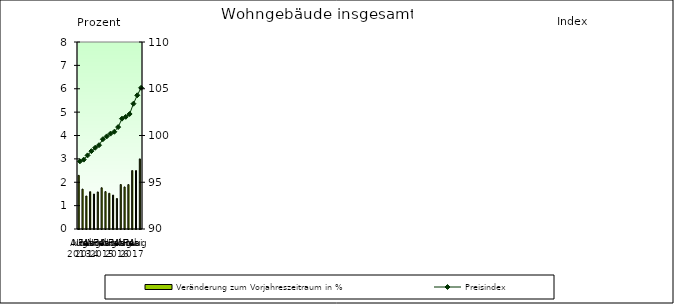
| Category | Veränderung zum Vorjahreszeitraum in % |
|---|---|
| 0 | 2.294 |
| 1 | 1.708 |
| 2 | 1.412 |
| 3 | 1.596 |
| 4 | 1.495 |
| 5 | 1.586 |
| 6 | 1.764 |
| 7 | 1.599 |
| 8 | 1.529 |
| 9 | 1.451 |
| 10 | 1.305 |
| 11 | 1.902 |
| 12 | 1.8 |
| 13 | 1.9 |
| 14 | 2.5 |
| 15 | 2.5 |
| 16 | 3 |